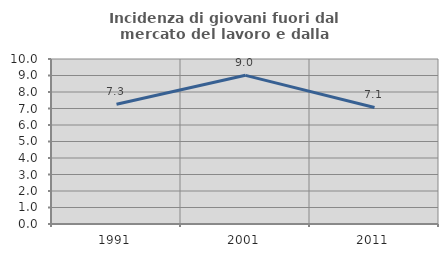
| Category | Incidenza di giovani fuori dal mercato del lavoro e dalla formazione  |
|---|---|
| 1991.0 | 7.253 |
| 2001.0 | 9.01 |
| 2011.0 | 7.062 |